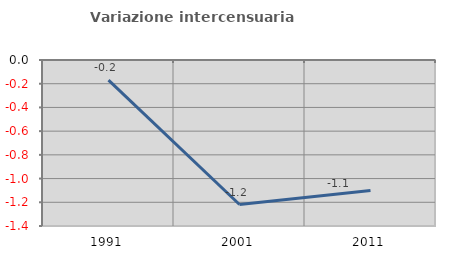
| Category | Variazione intercensuaria annua |
|---|---|
| 1991.0 | -0.17 |
| 2001.0 | -1.219 |
| 2011.0 | -1.101 |